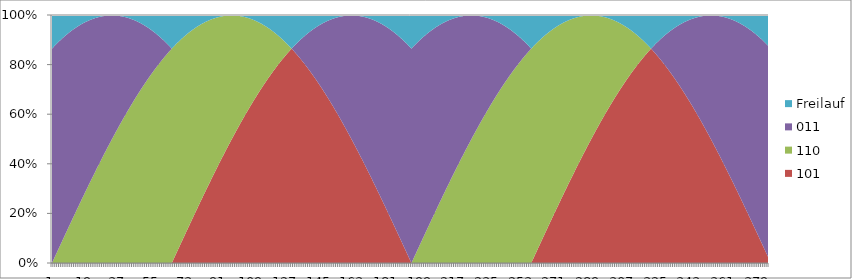
| Category | 101 | 110 | 011 | Freilauf |
|---|---|---|---|---|
| 0 | 0 | 0 | 0.864 | 0.136 |
| 1 | 0 | 0.016 | 0.856 | 0.128 |
| 2 | 0 | 0.033 | 0.848 | 0.12 |
| 3 | 0 | 0.049 | 0.839 | 0.112 |
| 4 | 0 | 0.065 | 0.83 | 0.105 |
| 5 | 0 | 0.082 | 0.821 | 0.098 |
| 6 | 0 | 0.098 | 0.811 | 0.091 |
| 7 | 0 | 0.114 | 0.802 | 0.084 |
| 8 | 0 | 0.13 | 0.792 | 0.078 |
| 9 | 0 | 0.146 | 0.782 | 0.072 |
| 10 | 0 | 0.163 | 0.772 | 0.066 |
| 11 | 0 | 0.179 | 0.761 | 0.06 |
| 12 | 0 | 0.195 | 0.75 | 0.055 |
| 13 | 0 | 0.211 | 0.74 | 0.05 |
| 14 | 0 | 0.227 | 0.729 | 0.045 |
| 15 | 0 | 0.243 | 0.717 | 0.04 |
| 16 | 0 | 0.258 | 0.706 | 0.036 |
| 17 | 0 | 0.274 | 0.694 | 0.032 |
| 18 | 0 | 0.29 | 0.682 | 0.028 |
| 19 | 0 | 0.305 | 0.67 | 0.024 |
| 20 | 0 | 0.321 | 0.658 | 0.021 |
| 21 | 0 | 0.336 | 0.646 | 0.018 |
| 22 | 0 | 0.352 | 0.633 | 0.015 |
| 23 | 0 | 0.367 | 0.621 | 0.013 |
| 24 | 0 | 0.382 | 0.608 | 0.01 |
| 25 | 0 | 0.397 | 0.595 | 0.008 |
| 26 | 0 | 0.412 | 0.581 | 0.007 |
| 27 | 0 | 0.427 | 0.568 | 0.005 |
| 28 | 0 | 0.441 | 0.555 | 0.004 |
| 29 | 0 | 0.456 | 0.541 | 0.003 |
| 30 | 0 | 0.471 | 0.527 | 0.002 |
| 31 | 0 | 0.485 | 0.513 | 0.002 |
| 32 | 0 | 0.499 | 0.499 | 0.002 |
| 33 | 0 | 0.513 | 0.485 | 0.002 |
| 34 | 0 | 0.527 | 0.471 | 0.002 |
| 35 | 0 | 0.541 | 0.456 | 0.003 |
| 36 | 0 | 0.555 | 0.441 | 0.004 |
| 37 | 0 | 0.568 | 0.427 | 0.005 |
| 38 | 0 | 0.581 | 0.412 | 0.007 |
| 39 | 0 | 0.595 | 0.397 | 0.008 |
| 40 | 0 | 0.608 | 0.382 | 0.01 |
| 41 | 0 | 0.621 | 0.367 | 0.013 |
| 42 | 0 | 0.633 | 0.352 | 0.015 |
| 43 | 0 | 0.646 | 0.336 | 0.018 |
| 44 | 0 | 0.658 | 0.321 | 0.021 |
| 45 | 0 | 0.67 | 0.305 | 0.024 |
| 46 | 0 | 0.682 | 0.29 | 0.028 |
| 47 | 0 | 0.694 | 0.274 | 0.032 |
| 48 | 0 | 0.706 | 0.258 | 0.036 |
| 49 | 0 | 0.717 | 0.243 | 0.04 |
| 50 | 0 | 0.729 | 0.227 | 0.045 |
| 51 | 0 | 0.74 | 0.211 | 0.05 |
| 52 | 0 | 0.75 | 0.195 | 0.055 |
| 53 | 0 | 0.761 | 0.179 | 0.06 |
| 54 | 0 | 0.772 | 0.163 | 0.066 |
| 55 | 0 | 0.782 | 0.146 | 0.072 |
| 56 | 0 | 0.792 | 0.13 | 0.078 |
| 57 | 0 | 0.802 | 0.114 | 0.084 |
| 58 | 0 | 0.811 | 0.098 | 0.091 |
| 59 | 0 | 0.821 | 0.082 | 0.098 |
| 60 | 0 | 0.83 | 0.065 | 0.105 |
| 61 | 0 | 0.839 | 0.049 | 0.112 |
| 62 | 0 | 0.848 | 0.033 | 0.12 |
| 63 | 0 | 0.856 | 0.016 | 0.128 |
| 64 | 0 | 0.864 | 0 | 0.136 |
| 65 | 0.016 | 0.856 | 0 | 0.128 |
| 66 | 0.033 | 0.848 | 0 | 0.12 |
| 67 | 0.049 | 0.839 | 0 | 0.112 |
| 68 | 0.065 | 0.83 | 0 | 0.105 |
| 69 | 0.082 | 0.821 | 0 | 0.098 |
| 70 | 0.098 | 0.811 | 0 | 0.091 |
| 71 | 0.114 | 0.802 | 0 | 0.084 |
| 72 | 0.13 | 0.792 | 0 | 0.078 |
| 73 | 0.146 | 0.782 | 0 | 0.072 |
| 74 | 0.163 | 0.772 | 0 | 0.066 |
| 75 | 0.179 | 0.761 | 0 | 0.06 |
| 76 | 0.195 | 0.75 | 0 | 0.055 |
| 77 | 0.211 | 0.74 | 0 | 0.05 |
| 78 | 0.227 | 0.729 | 0 | 0.045 |
| 79 | 0.243 | 0.717 | 0 | 0.04 |
| 80 | 0.258 | 0.706 | 0 | 0.036 |
| 81 | 0.274 | 0.694 | 0 | 0.032 |
| 82 | 0.29 | 0.682 | 0 | 0.028 |
| 83 | 0.305 | 0.67 | 0 | 0.024 |
| 84 | 0.321 | 0.658 | 0 | 0.021 |
| 85 | 0.336 | 0.646 | 0 | 0.018 |
| 86 | 0.352 | 0.633 | 0 | 0.015 |
| 87 | 0.367 | 0.621 | 0 | 0.013 |
| 88 | 0.382 | 0.608 | 0 | 0.01 |
| 89 | 0.397 | 0.595 | 0 | 0.008 |
| 90 | 0.412 | 0.581 | 0 | 0.007 |
| 91 | 0.427 | 0.568 | 0 | 0.005 |
| 92 | 0.441 | 0.555 | 0 | 0.004 |
| 93 | 0.456 | 0.541 | 0 | 0.003 |
| 94 | 0.471 | 0.527 | 0 | 0.002 |
| 95 | 0.485 | 0.513 | 0 | 0.002 |
| 96 | 0.499 | 0.499 | 0 | 0.002 |
| 97 | 0.513 | 0.485 | 0 | 0.002 |
| 98 | 0.527 | 0.471 | 0 | 0.002 |
| 99 | 0.541 | 0.456 | 0 | 0.003 |
| 100 | 0.555 | 0.441 | 0 | 0.004 |
| 101 | 0.568 | 0.427 | 0 | 0.005 |
| 102 | 0.581 | 0.412 | 0 | 0.007 |
| 103 | 0.595 | 0.397 | 0 | 0.008 |
| 104 | 0.608 | 0.382 | 0 | 0.01 |
| 105 | 0.621 | 0.367 | 0 | 0.013 |
| 106 | 0.633 | 0.352 | 0 | 0.015 |
| 107 | 0.646 | 0.336 | 0 | 0.018 |
| 108 | 0.658 | 0.321 | 0 | 0.021 |
| 109 | 0.67 | 0.305 | 0 | 0.024 |
| 110 | 0.682 | 0.29 | 0 | 0.028 |
| 111 | 0.694 | 0.274 | 0 | 0.032 |
| 112 | 0.706 | 0.258 | 0 | 0.036 |
| 113 | 0.717 | 0.243 | 0 | 0.04 |
| 114 | 0.729 | 0.227 | 0 | 0.045 |
| 115 | 0.74 | 0.211 | 0 | 0.05 |
| 116 | 0.75 | 0.195 | 0 | 0.055 |
| 117 | 0.761 | 0.179 | 0 | 0.06 |
| 118 | 0.772 | 0.163 | 0 | 0.066 |
| 119 | 0.782 | 0.146 | 0 | 0.072 |
| 120 | 0.792 | 0.13 | 0 | 0.078 |
| 121 | 0.802 | 0.114 | 0 | 0.084 |
| 122 | 0.811 | 0.098 | 0 | 0.091 |
| 123 | 0.821 | 0.082 | 0 | 0.098 |
| 124 | 0.83 | 0.065 | 0 | 0.105 |
| 125 | 0.839 | 0.049 | 0 | 0.112 |
| 126 | 0.848 | 0.033 | 0 | 0.12 |
| 127 | 0.856 | 0.016 | 0 | 0.128 |
| 128 | 0.864 | 0 | 0 | 0.136 |
| 129 | 0.856 | 0 | 0.016 | 0.128 |
| 130 | 0.848 | 0 | 0.033 | 0.12 |
| 131 | 0.839 | 0 | 0.049 | 0.112 |
| 132 | 0.83 | 0 | 0.065 | 0.105 |
| 133 | 0.821 | 0 | 0.082 | 0.098 |
| 134 | 0.811 | 0 | 0.098 | 0.091 |
| 135 | 0.802 | 0 | 0.114 | 0.084 |
| 136 | 0.792 | 0 | 0.13 | 0.078 |
| 137 | 0.782 | 0 | 0.146 | 0.072 |
| 138 | 0.772 | 0 | 0.163 | 0.066 |
| 139 | 0.761 | 0 | 0.179 | 0.06 |
| 140 | 0.75 | 0 | 0.195 | 0.055 |
| 141 | 0.74 | 0 | 0.211 | 0.05 |
| 142 | 0.729 | 0 | 0.227 | 0.045 |
| 143 | 0.717 | 0 | 0.243 | 0.04 |
| 144 | 0.706 | 0 | 0.258 | 0.036 |
| 145 | 0.694 | 0 | 0.274 | 0.032 |
| 146 | 0.682 | 0 | 0.29 | 0.028 |
| 147 | 0.67 | 0 | 0.305 | 0.024 |
| 148 | 0.658 | 0 | 0.321 | 0.021 |
| 149 | 0.646 | 0 | 0.336 | 0.018 |
| 150 | 0.633 | 0 | 0.352 | 0.015 |
| 151 | 0.621 | 0 | 0.367 | 0.013 |
| 152 | 0.608 | 0 | 0.382 | 0.01 |
| 153 | 0.595 | 0 | 0.397 | 0.008 |
| 154 | 0.581 | 0 | 0.412 | 0.007 |
| 155 | 0.568 | 0 | 0.427 | 0.005 |
| 156 | 0.555 | 0 | 0.441 | 0.004 |
| 157 | 0.541 | 0 | 0.456 | 0.003 |
| 158 | 0.527 | 0 | 0.471 | 0.002 |
| 159 | 0.513 | 0 | 0.485 | 0.002 |
| 160 | 0.499 | 0 | 0.499 | 0.002 |
| 161 | 0.485 | 0 | 0.513 | 0.002 |
| 162 | 0.471 | 0 | 0.527 | 0.002 |
| 163 | 0.456 | 0 | 0.541 | 0.003 |
| 164 | 0.441 | 0 | 0.555 | 0.004 |
| 165 | 0.427 | 0 | 0.568 | 0.005 |
| 166 | 0.412 | 0 | 0.581 | 0.007 |
| 167 | 0.397 | 0 | 0.595 | 0.008 |
| 168 | 0.382 | 0 | 0.608 | 0.01 |
| 169 | 0.367 | 0 | 0.621 | 0.013 |
| 170 | 0.352 | 0 | 0.633 | 0.015 |
| 171 | 0.336 | 0 | 0.646 | 0.018 |
| 172 | 0.321 | 0 | 0.658 | 0.021 |
| 173 | 0.305 | 0 | 0.67 | 0.024 |
| 174 | 0.29 | 0 | 0.682 | 0.028 |
| 175 | 0.274 | 0 | 0.694 | 0.032 |
| 176 | 0.258 | 0 | 0.706 | 0.036 |
| 177 | 0.243 | 0 | 0.717 | 0.04 |
| 178 | 0.227 | 0 | 0.729 | 0.045 |
| 179 | 0.211 | 0 | 0.74 | 0.05 |
| 180 | 0.195 | 0 | 0.75 | 0.055 |
| 181 | 0.179 | 0 | 0.761 | 0.06 |
| 182 | 0.163 | 0 | 0.772 | 0.066 |
| 183 | 0.146 | 0 | 0.782 | 0.072 |
| 184 | 0.13 | 0 | 0.792 | 0.078 |
| 185 | 0.114 | 0 | 0.802 | 0.084 |
| 186 | 0.098 | 0 | 0.811 | 0.091 |
| 187 | 0.082 | 0 | 0.821 | 0.098 |
| 188 | 0.065 | 0 | 0.83 | 0.105 |
| 189 | 0.049 | 0 | 0.839 | 0.112 |
| 190 | 0.033 | 0 | 0.848 | 0.12 |
| 191 | 0.016 | 0 | 0.856 | 0.128 |
| 192 | 0 | 0 | 0.864 | 0.136 |
| 193 | 0 | 0.016 | 0.856 | 0.128 |
| 194 | 0 | 0.033 | 0.848 | 0.12 |
| 195 | 0 | 0.049 | 0.839 | 0.112 |
| 196 | 0 | 0.065 | 0.83 | 0.105 |
| 197 | 0 | 0.082 | 0.821 | 0.098 |
| 198 | 0 | 0.098 | 0.811 | 0.091 |
| 199 | 0 | 0.114 | 0.802 | 0.084 |
| 200 | 0 | 0.13 | 0.792 | 0.078 |
| 201 | 0 | 0.146 | 0.782 | 0.072 |
| 202 | 0 | 0.163 | 0.772 | 0.066 |
| 203 | 0 | 0.179 | 0.761 | 0.06 |
| 204 | 0 | 0.195 | 0.75 | 0.055 |
| 205 | 0 | 0.211 | 0.74 | 0.05 |
| 206 | 0 | 0.227 | 0.729 | 0.045 |
| 207 | 0 | 0.243 | 0.717 | 0.04 |
| 208 | 0 | 0.258 | 0.706 | 0.036 |
| 209 | 0 | 0.274 | 0.694 | 0.032 |
| 210 | 0 | 0.29 | 0.682 | 0.028 |
| 211 | 0 | 0.305 | 0.67 | 0.024 |
| 212 | 0 | 0.321 | 0.658 | 0.021 |
| 213 | 0 | 0.336 | 0.646 | 0.018 |
| 214 | 0 | 0.352 | 0.633 | 0.015 |
| 215 | 0 | 0.367 | 0.621 | 0.013 |
| 216 | 0 | 0.382 | 0.608 | 0.01 |
| 217 | 0 | 0.397 | 0.595 | 0.008 |
| 218 | 0 | 0.412 | 0.581 | 0.007 |
| 219 | 0 | 0.427 | 0.568 | 0.005 |
| 220 | 0 | 0.441 | 0.555 | 0.004 |
| 221 | 0 | 0.456 | 0.541 | 0.003 |
| 222 | 0 | 0.471 | 0.527 | 0.002 |
| 223 | 0 | 0.485 | 0.513 | 0.002 |
| 224 | 0 | 0.499 | 0.499 | 0.002 |
| 225 | 0 | 0.513 | 0.485 | 0.002 |
| 226 | 0 | 0.527 | 0.471 | 0.002 |
| 227 | 0 | 0.541 | 0.456 | 0.003 |
| 228 | 0 | 0.555 | 0.441 | 0.004 |
| 229 | 0 | 0.568 | 0.427 | 0.005 |
| 230 | 0 | 0.581 | 0.412 | 0.007 |
| 231 | 0 | 0.595 | 0.397 | 0.008 |
| 232 | 0 | 0.608 | 0.382 | 0.01 |
| 233 | 0 | 0.621 | 0.367 | 0.013 |
| 234 | 0 | 0.633 | 0.352 | 0.015 |
| 235 | 0 | 0.646 | 0.336 | 0.018 |
| 236 | 0 | 0.658 | 0.321 | 0.021 |
| 237 | 0 | 0.67 | 0.305 | 0.024 |
| 238 | 0 | 0.682 | 0.29 | 0.028 |
| 239 | 0 | 0.694 | 0.274 | 0.032 |
| 240 | 0 | 0.706 | 0.258 | 0.036 |
| 241 | 0 | 0.717 | 0.243 | 0.04 |
| 242 | 0 | 0.729 | 0.227 | 0.045 |
| 243 | 0 | 0.74 | 0.211 | 0.05 |
| 244 | 0 | 0.75 | 0.195 | 0.055 |
| 245 | 0 | 0.761 | 0.179 | 0.06 |
| 246 | 0 | 0.772 | 0.163 | 0.066 |
| 247 | 0 | 0.782 | 0.146 | 0.072 |
| 248 | 0 | 0.792 | 0.13 | 0.078 |
| 249 | 0 | 0.802 | 0.114 | 0.084 |
| 250 | 0 | 0.811 | 0.098 | 0.091 |
| 251 | 0 | 0.821 | 0.082 | 0.098 |
| 252 | 0 | 0.83 | 0.065 | 0.105 |
| 253 | 0 | 0.839 | 0.049 | 0.112 |
| 254 | 0 | 0.848 | 0.033 | 0.12 |
| 255 | 0 | 0.856 | 0.016 | 0.128 |
| 256 | 0 | 0.864 | 0 | 0.136 |
| 257 | 0.016 | 0.856 | 0 | 0.128 |
| 258 | 0.033 | 0.848 | 0 | 0.12 |
| 259 | 0.049 | 0.839 | 0 | 0.112 |
| 260 | 0.065 | 0.83 | 0 | 0.105 |
| 261 | 0.082 | 0.821 | 0 | 0.098 |
| 262 | 0.098 | 0.811 | 0 | 0.091 |
| 263 | 0.114 | 0.802 | 0 | 0.084 |
| 264 | 0.13 | 0.792 | 0 | 0.078 |
| 265 | 0.146 | 0.782 | 0 | 0.072 |
| 266 | 0.163 | 0.772 | 0 | 0.066 |
| 267 | 0.179 | 0.761 | 0 | 0.06 |
| 268 | 0.195 | 0.75 | 0 | 0.055 |
| 269 | 0.211 | 0.74 | 0 | 0.05 |
| 270 | 0.227 | 0.729 | 0 | 0.045 |
| 271 | 0.243 | 0.717 | 0 | 0.04 |
| 272 | 0.258 | 0.706 | 0 | 0.036 |
| 273 | 0.274 | 0.694 | 0 | 0.032 |
| 274 | 0.29 | 0.682 | 0 | 0.028 |
| 275 | 0.305 | 0.67 | 0 | 0.024 |
| 276 | 0.321 | 0.658 | 0 | 0.021 |
| 277 | 0.336 | 0.646 | 0 | 0.018 |
| 278 | 0.352 | 0.633 | 0 | 0.015 |
| 279 | 0.367 | 0.621 | 0 | 0.013 |
| 280 | 0.382 | 0.608 | 0 | 0.01 |
| 281 | 0.397 | 0.595 | 0 | 0.008 |
| 282 | 0.412 | 0.581 | 0 | 0.007 |
| 283 | 0.427 | 0.568 | 0 | 0.005 |
| 284 | 0.441 | 0.555 | 0 | 0.004 |
| 285 | 0.456 | 0.541 | 0 | 0.003 |
| 286 | 0.471 | 0.527 | 0 | 0.002 |
| 287 | 0.485 | 0.513 | 0 | 0.002 |
| 288 | 0.499 | 0.499 | 0 | 0.002 |
| 289 | 0.513 | 0.485 | 0 | 0.002 |
| 290 | 0.527 | 0.471 | 0 | 0.002 |
| 291 | 0.541 | 0.456 | 0 | 0.003 |
| 292 | 0.555 | 0.441 | 0 | 0.004 |
| 293 | 0.568 | 0.427 | 0 | 0.005 |
| 294 | 0.581 | 0.412 | 0 | 0.007 |
| 295 | 0.595 | 0.397 | 0 | 0.008 |
| 296 | 0.608 | 0.382 | 0 | 0.01 |
| 297 | 0.621 | 0.367 | 0 | 0.013 |
| 298 | 0.633 | 0.352 | 0 | 0.015 |
| 299 | 0.646 | 0.336 | 0 | 0.018 |
| 300 | 0.658 | 0.321 | 0 | 0.021 |
| 301 | 0.67 | 0.305 | 0 | 0.024 |
| 302 | 0.682 | 0.29 | 0 | 0.028 |
| 303 | 0.694 | 0.274 | 0 | 0.032 |
| 304 | 0.706 | 0.258 | 0 | 0.036 |
| 305 | 0.717 | 0.243 | 0 | 0.04 |
| 306 | 0.729 | 0.227 | 0 | 0.045 |
| 307 | 0.74 | 0.211 | 0 | 0.05 |
| 308 | 0.75 | 0.195 | 0 | 0.055 |
| 309 | 0.761 | 0.179 | 0 | 0.06 |
| 310 | 0.772 | 0.163 | 0 | 0.066 |
| 311 | 0.782 | 0.146 | 0 | 0.072 |
| 312 | 0.792 | 0.13 | 0 | 0.078 |
| 313 | 0.802 | 0.114 | 0 | 0.084 |
| 314 | 0.811 | 0.098 | 0 | 0.091 |
| 315 | 0.821 | 0.082 | 0 | 0.098 |
| 316 | 0.83 | 0.065 | 0 | 0.105 |
| 317 | 0.839 | 0.049 | 0 | 0.112 |
| 318 | 0.848 | 0.033 | 0 | 0.12 |
| 319 | 0.856 | 0.016 | 0 | 0.128 |
| 320 | 0.864 | 0 | 0 | 0.136 |
| 321 | 0.856 | 0 | 0.016 | 0.128 |
| 322 | 0.848 | 0 | 0.033 | 0.12 |
| 323 | 0.839 | 0 | 0.049 | 0.112 |
| 324 | 0.83 | 0 | 0.065 | 0.105 |
| 325 | 0.821 | 0 | 0.082 | 0.098 |
| 326 | 0.811 | 0 | 0.098 | 0.091 |
| 327 | 0.802 | 0 | 0.114 | 0.084 |
| 328 | 0.792 | 0 | 0.13 | 0.078 |
| 329 | 0.782 | 0 | 0.146 | 0.072 |
| 330 | 0.772 | 0 | 0.163 | 0.066 |
| 331 | 0.761 | 0 | 0.179 | 0.06 |
| 332 | 0.75 | 0 | 0.195 | 0.055 |
| 333 | 0.74 | 0 | 0.211 | 0.05 |
| 334 | 0.729 | 0 | 0.227 | 0.045 |
| 335 | 0.717 | 0 | 0.243 | 0.04 |
| 336 | 0.706 | 0 | 0.258 | 0.036 |
| 337 | 0.694 | 0 | 0.274 | 0.032 |
| 338 | 0.682 | 0 | 0.29 | 0.028 |
| 339 | 0.67 | 0 | 0.305 | 0.024 |
| 340 | 0.658 | 0 | 0.321 | 0.021 |
| 341 | 0.646 | 0 | 0.336 | 0.018 |
| 342 | 0.633 | 0 | 0.352 | 0.015 |
| 343 | 0.621 | 0 | 0.367 | 0.013 |
| 344 | 0.608 | 0 | 0.382 | 0.01 |
| 345 | 0.595 | 0 | 0.397 | 0.008 |
| 346 | 0.581 | 0 | 0.412 | 0.007 |
| 347 | 0.568 | 0 | 0.427 | 0.005 |
| 348 | 0.555 | 0 | 0.441 | 0.004 |
| 349 | 0.541 | 0 | 0.456 | 0.003 |
| 350 | 0.527 | 0 | 0.471 | 0.002 |
| 351 | 0.513 | 0 | 0.485 | 0.002 |
| 352 | 0.499 | 0 | 0.499 | 0.002 |
| 353 | 0.485 | 0 | 0.513 | 0.002 |
| 354 | 0.471 | 0 | 0.527 | 0.002 |
| 355 | 0.456 | 0 | 0.541 | 0.003 |
| 356 | 0.441 | 0 | 0.555 | 0.004 |
| 357 | 0.427 | 0 | 0.568 | 0.005 |
| 358 | 0.412 | 0 | 0.581 | 0.007 |
| 359 | 0.397 | 0 | 0.595 | 0.008 |
| 360 | 0.382 | 0 | 0.608 | 0.01 |
| 361 | 0.367 | 0 | 0.621 | 0.013 |
| 362 | 0.352 | 0 | 0.633 | 0.015 |
| 363 | 0.336 | 0 | 0.646 | 0.018 |
| 364 | 0.321 | 0 | 0.658 | 0.021 |
| 365 | 0.305 | 0 | 0.67 | 0.024 |
| 366 | 0.29 | 0 | 0.682 | 0.028 |
| 367 | 0.274 | 0 | 0.694 | 0.032 |
| 368 | 0.258 | 0 | 0.706 | 0.036 |
| 369 | 0.243 | 0 | 0.717 | 0.04 |
| 370 | 0.227 | 0 | 0.729 | 0.045 |
| 371 | 0.211 | 0 | 0.74 | 0.05 |
| 372 | 0.195 | 0 | 0.75 | 0.055 |
| 373 | 0.179 | 0 | 0.761 | 0.06 |
| 374 | 0.163 | 0 | 0.772 | 0.066 |
| 375 | 0.146 | 0 | 0.782 | 0.072 |
| 376 | 0.13 | 0 | 0.792 | 0.078 |
| 377 | 0.114 | 0 | 0.802 | 0.084 |
| 378 | 0.098 | 0 | 0.811 | 0.091 |
| 379 | 0.082 | 0 | 0.821 | 0.098 |
| 380 | 0.065 | 0 | 0.83 | 0.105 |
| 381 | 0.049 | 0 | 0.839 | 0.112 |
| 382 | 0.033 | 0 | 0.848 | 0.12 |
| 383 | 0.016 | 0 | 0.856 | 0.128 |